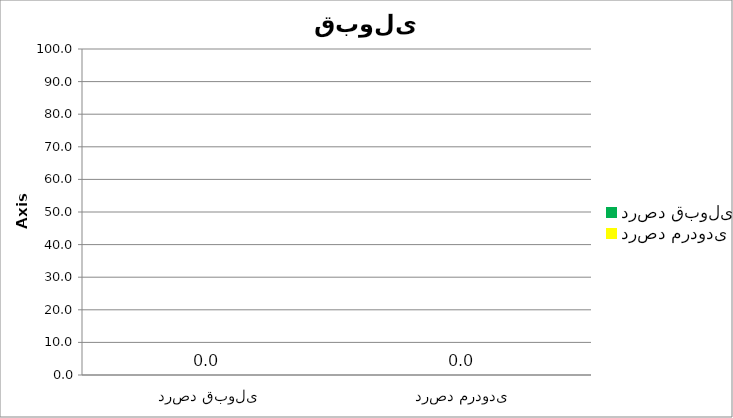
| Category | Series 0 |
|---|---|
| درصد قبولی | 0 |
| درصد مردودی | 0 |